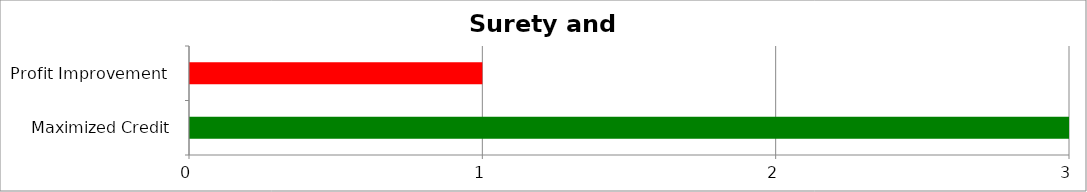
| Category | Low | Medium | High |
|---|---|---|---|
| Maximized Credit | 3 | 0 | 0 |
| Profit Improvement  | 0 | 0 | 1 |